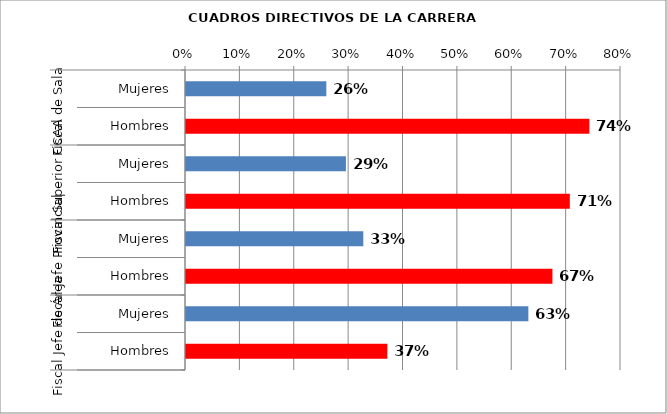
| Category | Series 0 |
|---|---|
| 0 | 0.258 |
| 1 | 0.742 |
| 2 | 0.294 |
| 3 | 0.706 |
| 4 | 0.326 |
| 5 | 0.674 |
| 6 | 0.63 |
| 7 | 0.37 |